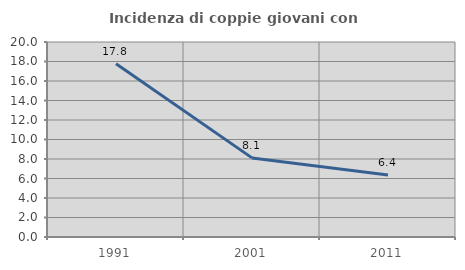
| Category | Incidenza di coppie giovani con figli |
|---|---|
| 1991.0 | 17.762 |
| 2001.0 | 8.114 |
| 2011.0 | 6.352 |